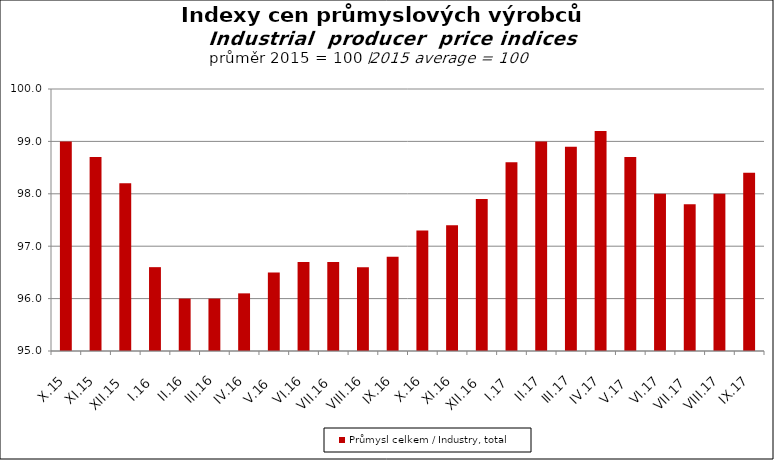
| Category | Průmysl celkem / Industry, total |
|---|---|
| X.15 | 99 |
| XI.15 | 98.7 |
| XII.15 | 98.2 |
| I.16 | 96.6 |
| II.16 | 96 |
| III.16 | 96 |
| IV.16 | 96.1 |
| V.16 | 96.5 |
| VI.16 | 96.7 |
| VII.16 | 96.7 |
| VIII.16 | 96.6 |
| IX.16 | 96.8 |
| X.16 | 97.3 |
| XI.16 | 97.4 |
| XII.16 | 97.9 |
| I.17 | 98.6 |
| II.17 | 99 |
| III.17 | 98.9 |
| IV.17 | 99.2 |
| V.17 | 98.7 |
| VI.17 | 98 |
| VII.17 | 97.8 |
| VIII.17 | 98 |
| IX.17 | 98.4 |